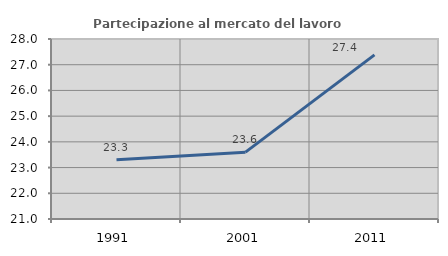
| Category | Partecipazione al mercato del lavoro  femminile |
|---|---|
| 1991.0 | 23.301 |
| 2001.0 | 23.599 |
| 2011.0 | 27.381 |